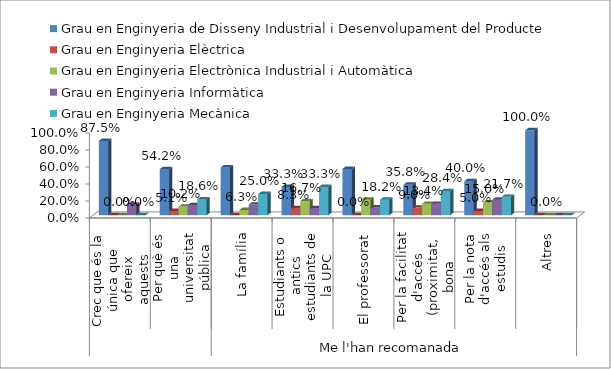
| Category | Grau en Enginyeria de Disseny Industrial i Desenvolupament del Producte | Grau en Enginyeria Elèctrica | Grau en Enginyeria Electrònica Industrial i Automàtica | Grau en Enginyeria Informàtica | Grau en Enginyeria Mecànica |
|---|---|---|---|---|---|
| 0 | 0.875 | 0 | 0 | 0.125 | 0 |
| 1 | 0.542 | 0.051 | 0.102 | 0.119 | 0.186 |
| 2 | 0.562 | 0 | 0.062 | 0.125 | 0.25 |
| 3 | 0.333 | 0.083 | 0.167 | 0.083 | 0.333 |
| 4 | 0.545 | 0 | 0.182 | 0.091 | 0.182 |
| 5 | 0.358 | 0.09 | 0.134 | 0.134 | 0.284 |
| 6 | 0.4 | 0.05 | 0.15 | 0.183 | 0.217 |
| 7 | 1 | 0 | 0 | 0 | 0 |